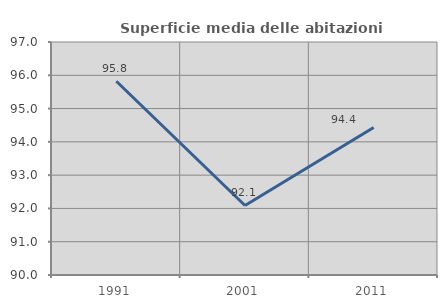
| Category | Superficie media delle abitazioni occupate |
|---|---|
| 1991.0 | 95.82 |
| 2001.0 | 92.088 |
| 2011.0 | 94.431 |